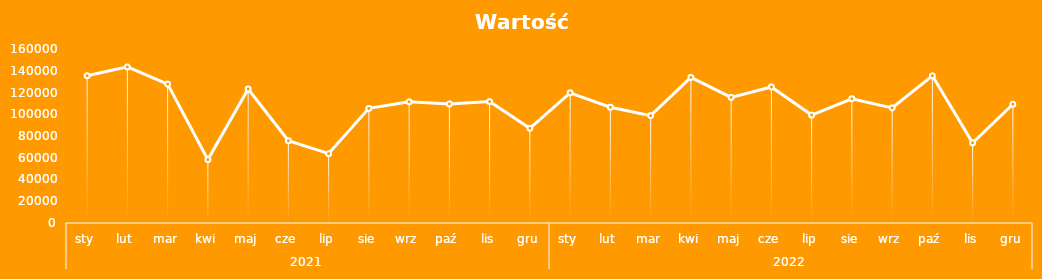
| Category | Suma |
|---|---|
| 0 | 135457.93 |
| 1 | 143533.71 |
| 2 | 127732.23 |
| 3 | 58293.75 |
| 4 | 123210.86 |
| 5 | 75612.15 |
| 6 | 63798.07 |
| 7 | 105399.82 |
| 8 | 111457.61 |
| 9 | 109507.11 |
| 10 | 111678.08 |
| 11 | 87075.33 |
| 12 | 119658.96 |
| 13 | 106427.86 |
| 14 | 98706.65 |
| 15 | 133867.45 |
| 16 | 115532.51 |
| 17 | 125122.57 |
| 18 | 99226.88 |
| 19 | 114221.44 |
| 20 | 105846.78 |
| 21 | 135349.44 |
| 22 | 73741.3 |
| 23 | 109229.78 |